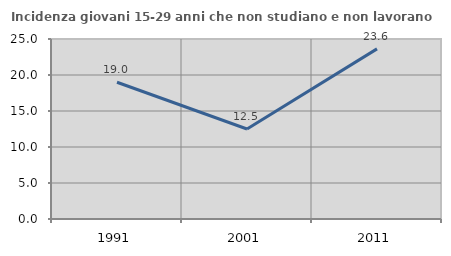
| Category | Incidenza giovani 15-29 anni che non studiano e non lavorano  |
|---|---|
| 1991.0 | 18.992 |
| 2001.0 | 12.5 |
| 2011.0 | 23.626 |